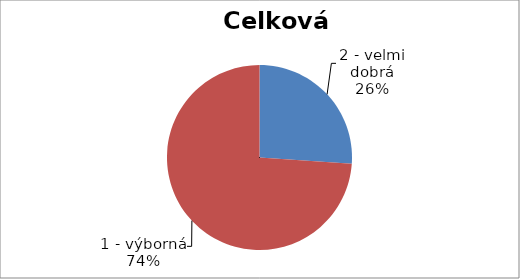
| Category | Celkem |
|---|---|
| 2 - velmi dobrá | 6 |
| 1 - výborná | 17 |